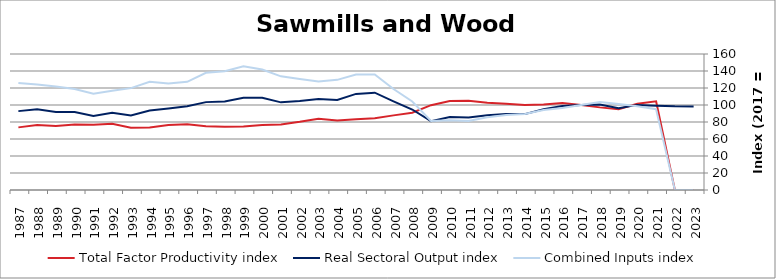
| Category | Total Factor Productivity index | Real Sectoral Output index | Combined Inputs index |
|---|---|---|---|
| 2023.0 | 0 | 98.35 | 0 |
| 2022.0 | 0 | 98.474 | 0 |
| 2021.0 | 104.38 | 99.251 | 95.087 |
| 2020.0 | 101.559 | 100.137 | 98.599 |
| 2019.0 | 95.092 | 96.219 | 101.184 |
| 2018.0 | 97.204 | 100.682 | 103.578 |
| 2017.0 | 100 | 100 | 100 |
| 2016.0 | 102.343 | 98.774 | 96.512 |
| 2015.0 | 100.693 | 94.89 | 94.237 |
| 2014.0 | 99.904 | 89.285 | 89.371 |
| 2013.0 | 101.443 | 89.382 | 88.111 |
| 2012.0 | 102.77 | 87.904 | 85.535 |
| 2011.0 | 104.951 | 85.314 | 81.29 |
| 2010.0 | 104.694 | 85.781 | 81.935 |
| 2009.0 | 99.785 | 81.034 | 81.208 |
| 2008.0 | 90.951 | 94.686 | 104.106 |
| 2007.0 | 87.798 | 104.336 | 118.836 |
| 2006.0 | 84.338 | 114.526 | 135.794 |
| 2005.0 | 83.188 | 113.058 | 135.906 |
| 2004.0 | 81.691 | 105.867 | 129.594 |
| 2003.0 | 83.815 | 106.97 | 127.627 |
| 2002.0 | 80.2 | 104.742 | 130.6 |
| 2001.0 | 77.114 | 103.1 | 133.697 |
| 2000.0 | 76.51 | 108.518 | 141.835 |
| 1999.0 | 74.633 | 108.56 | 145.459 |
| 1998.0 | 74.516 | 104.142 | 139.759 |
| 1997.0 | 74.977 | 103.383 | 137.887 |
| 1996.0 | 77.37 | 98.49 | 127.298 |
| 1995.0 | 76.485 | 95.923 | 125.414 |
| 1994.0 | 73.587 | 93.619 | 127.222 |
| 1993.0 | 73.146 | 87.658 | 119.839 |
| 1992.0 | 77.931 | 90.909 | 116.654 |
| 1991.0 | 76.869 | 87.12 | 113.335 |
| 1990.0 | 77.054 | 91.643 | 118.934 |
| 1989.0 | 75.397 | 91.91 | 121.901 |
| 1988.0 | 76.48 | 94.848 | 124.017 |
| 1987.0 | 73.678 | 92.793 | 125.944 |